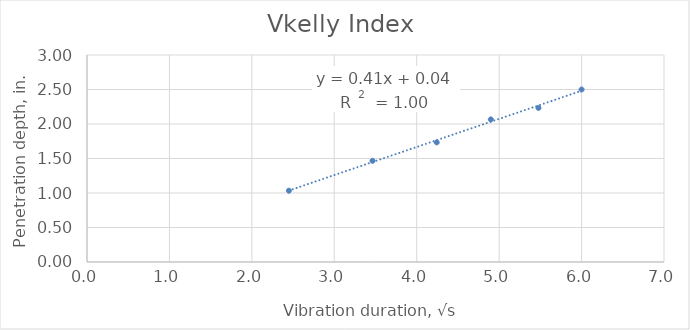
| Category | Vkelly Index |
|---|---|
| 2.449489742783178 | 1.033 |
| 3.4641016151377544 | 1.467 |
| 4.242640687119285 | 1.733 |
| 4.898979485566356 | 2.067 |
| 5.477225575051661 | 2.233 |
| 6.0 | 2.5 |